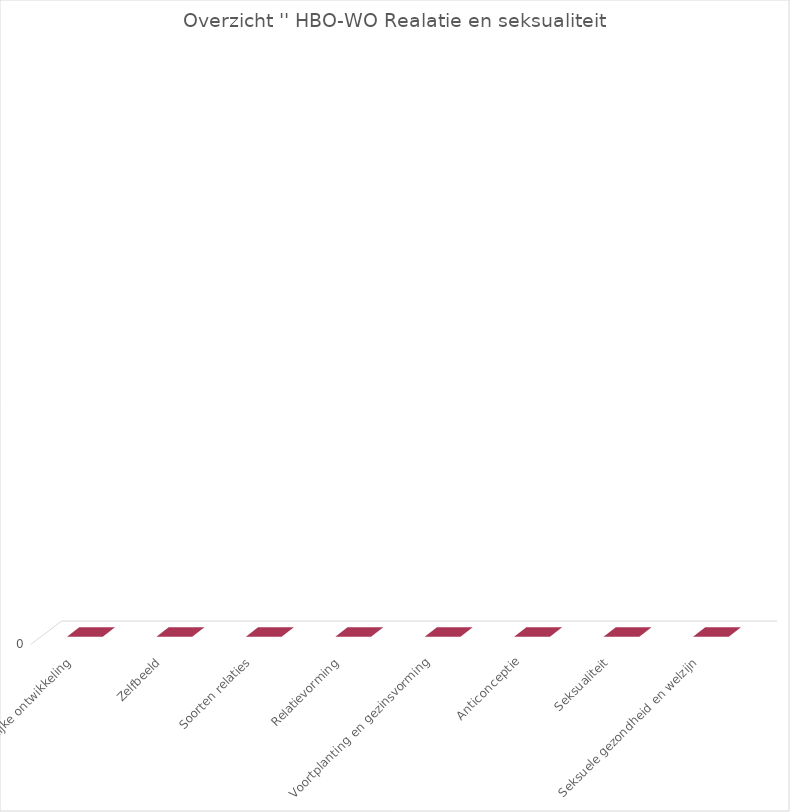
| Category | Series 2 |
|---|---|
| Lichamelijke ontwikkeling | 0 |
| Zelfbeeld | 0 |
| Soorten relaties | 0 |
| Relatievorming | 0 |
| Voortplanting en gezinsvorming | 0 |
| Anticonceptie | 0 |
| Seksualiteit | 0 |
| Seksuele gezondheid en welzijn | 0 |